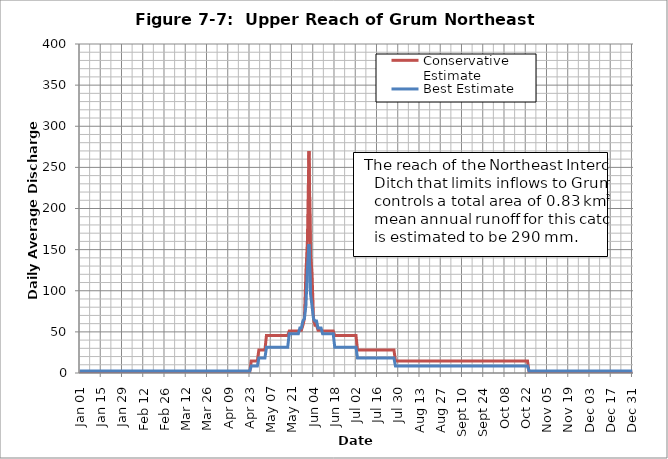
| Category | Conservative Estimate | Best Estimate |
|---|---|---|
| 2005-01-01 | 1.303 | 2.436 |
| 2005-01-02 | 1.303 | 2.436 |
| 2005-01-03 | 1.303 | 2.436 |
| 2005-01-04 | 1.303 | 2.436 |
| 2005-01-05 | 1.303 | 2.436 |
| 2005-01-06 | 1.303 | 2.436 |
| 2005-01-07 | 1.303 | 2.436 |
| 2005-01-08 | 1.303 | 2.436 |
| 2005-01-09 | 1.303 | 2.436 |
| 2005-01-10 | 1.303 | 2.436 |
| 2005-01-11 | 1.303 | 2.436 |
| 2005-01-12 | 1.303 | 2.436 |
| 2005-01-13 | 1.303 | 2.436 |
| 2005-01-14 | 1.303 | 2.436 |
| 2005-01-15 | 1.303 | 2.436 |
| 2005-01-16 | 1.303 | 2.436 |
| 2005-01-17 | 1.303 | 2.436 |
| 2005-01-18 | 1.303 | 2.436 |
| 2005-01-19 | 1.303 | 2.436 |
| 2005-01-20 | 1.303 | 2.436 |
| 2005-01-21 | 1.303 | 2.436 |
| 2005-01-22 | 1.303 | 2.436 |
| 2005-01-23 | 1.303 | 2.436 |
| 2005-01-24 | 1.303 | 2.436 |
| 2005-01-25 | 1.303 | 2.436 |
| 2005-01-26 | 1.303 | 2.436 |
| 2005-01-27 | 1.303 | 2.436 |
| 2005-01-28 | 1.303 | 2.436 |
| 2005-01-29 | 1.303 | 2.436 |
| 2005-01-30 | 1.303 | 2.436 |
| 2005-01-31 | 1.303 | 2.436 |
| 2005-02-01 | 1.303 | 2.436 |
| 2005-02-02 | 1.303 | 2.436 |
| 2005-02-03 | 1.303 | 2.436 |
| 2005-02-04 | 1.303 | 2.436 |
| 2005-02-05 | 1.303 | 2.436 |
| 2005-02-06 | 1.303 | 2.436 |
| 2005-02-07 | 1.303 | 2.436 |
| 2005-02-08 | 1.303 | 2.436 |
| 2005-02-09 | 1.303 | 2.436 |
| 2005-02-10 | 1.303 | 2.436 |
| 2005-02-11 | 1.303 | 2.436 |
| 2005-02-12 | 1.303 | 2.436 |
| 2005-02-13 | 1.303 | 2.436 |
| 2005-02-14 | 1.303 | 2.436 |
| 2005-02-15 | 1.303 | 2.436 |
| 2005-02-16 | 1.303 | 2.436 |
| 2005-02-17 | 1.303 | 2.436 |
| 2005-02-18 | 1.303 | 2.436 |
| 2005-02-19 | 1.303 | 2.436 |
| 2005-02-20 | 1.303 | 2.436 |
| 2005-02-21 | 1.303 | 2.436 |
| 2005-02-22 | 1.303 | 2.436 |
| 2005-02-23 | 1.303 | 2.436 |
| 2005-02-24 | 1.303 | 2.436 |
| 2005-02-25 | 1.303 | 2.436 |
| 2005-02-26 | 1.303 | 2.436 |
| 2005-02-27 | 1.303 | 2.436 |
| 2005-02-28 | 1.303 | 2.436 |
| 2005-03-01 | 1.303 | 2.436 |
| 2005-03-02 | 1.303 | 2.436 |
| 2005-03-03 | 1.303 | 2.436 |
| 2005-03-04 | 1.303 | 2.436 |
| 2005-03-05 | 1.303 | 2.436 |
| 2005-03-06 | 1.303 | 2.436 |
| 2005-03-07 | 1.303 | 2.436 |
| 2005-03-08 | 1.303 | 2.436 |
| 2005-03-09 | 1.303 | 2.436 |
| 2005-03-10 | 1.303 | 2.436 |
| 2005-03-11 | 1.303 | 2.436 |
| 2005-03-12 | 1.303 | 2.436 |
| 2005-03-13 | 1.303 | 2.436 |
| 2005-03-14 | 1.303 | 2.436 |
| 2005-03-15 | 1.303 | 2.436 |
| 2005-03-16 | 1.303 | 2.436 |
| 2005-03-17 | 1.303 | 2.436 |
| 2005-03-18 | 1.303 | 2.436 |
| 2005-03-19 | 1.303 | 2.436 |
| 2005-03-20 | 1.303 | 2.436 |
| 2005-03-21 | 1.303 | 2.436 |
| 2005-03-22 | 1.303 | 2.436 |
| 2005-03-23 | 1.303 | 2.436 |
| 2005-03-24 | 1.303 | 2.436 |
| 2005-03-25 | 1.303 | 2.436 |
| 2005-03-26 | 1.303 | 2.436 |
| 2005-03-27 | 1.303 | 2.436 |
| 2005-03-28 | 1.303 | 2.436 |
| 2005-03-29 | 1.303 | 2.436 |
| 2005-03-30 | 1.303 | 2.436 |
| 2005-03-31 | 1.303 | 2.436 |
| 2005-04-01 | 1.303 | 2.436 |
| 2005-04-02 | 1.303 | 2.436 |
| 2005-04-03 | 1.303 | 2.436 |
| 2005-04-04 | 1.303 | 2.436 |
| 2005-04-05 | 1.303 | 2.436 |
| 2005-04-06 | 1.303 | 2.436 |
| 2005-04-07 | 1.303 | 2.436 |
| 2005-04-08 | 1.303 | 2.436 |
| 2005-04-09 | 1.303 | 2.436 |
| 2005-04-10 | 1.303 | 2.436 |
| 2005-04-11 | 1.303 | 2.436 |
| 2005-04-12 | 1.303 | 2.436 |
| 2005-04-13 | 1.303 | 2.436 |
| 2005-04-14 | 1.303 | 2.436 |
| 2005-04-15 | 1.303 | 2.436 |
| 2005-04-16 | 1.303 | 2.436 |
| 2005-04-17 | 1.303 | 2.436 |
| 2005-04-18 | 1.303 | 2.436 |
| 2005-04-19 | 1.303 | 2.436 |
| 2005-04-20 | 1.303 | 2.436 |
| 2005-04-21 | 1.303 | 2.436 |
| 2005-04-22 | 1.303 | 2.436 |
| 2005-04-23 | 1.303 | 2.436 |
| 2005-04-24 | 14.719 | 8.434 |
| 2005-04-25 | 14.719 | 8.434 |
| 2005-04-26 | 14.719 | 8.434 |
| 2005-04-27 | 14.719 | 8.434 |
| 2005-04-28 | 14.719 | 8.434 |
| 2005-04-29 | 28.056 | 18.106 |
| 2005-04-30 | 28.056 | 18.106 |
| 2005-05-01 | 28.056 | 18.106 |
| 2005-05-02 | 28.056 | 18.106 |
| 2005-05-03 | 28.056 | 18.106 |
| 2005-05-04 | 45.58 | 31.293 |
| 2005-05-05 | 45.58 | 31.293 |
| 2005-05-06 | 45.58 | 31.293 |
| 2005-05-07 | 45.58 | 31.293 |
| 2005-05-08 | 45.58 | 31.293 |
| 2005-05-09 | 45.58 | 31.293 |
| 2005-05-10 | 45.58 | 31.293 |
| 2005-05-11 | 45.58 | 31.293 |
| 2005-05-12 | 45.58 | 31.293 |
| 2005-05-13 | 45.58 | 31.293 |
| 2005-05-14 | 45.58 | 31.293 |
| 2005-05-15 | 45.58 | 31.293 |
| 2005-05-16 | 45.58 | 31.293 |
| 2005-05-17 | 45.58 | 31.293 |
| 2005-05-18 | 45.58 | 31.293 |
| 2005-05-19 | 50.969 | 47.653 |
| 2005-05-20 | 50.969 | 47.653 |
| 2005-05-21 | 50.969 | 47.653 |
| 2005-05-22 | 50.969 | 47.653 |
| 2005-05-23 | 50.969 | 47.653 |
| 2005-05-24 | 50.969 | 47.653 |
| 2005-05-25 | 50.969 | 47.653 |
| 2005-05-26 | 51.938 | 54.648 |
| 2005-05-27 | 51.938 | 54.648 |
| 2005-05-28 | 57.965 | 63.169 |
| 2005-05-29 | 65.978 | 65.954 |
| 2005-05-30 | 121.132 | 82.068 |
| 2005-05-31 | 161.307 | 126.529 |
| 2005-06-01 | 269.75 | 156.605 |
| 2005-06-02 | 145.378 | 96.989 |
| 2005-06-03 | 121.132 | 82.068 |
| 2005-06-04 | 65.978 | 65.954 |
| 2005-06-05 | 57.965 | 63.169 |
| 2005-06-06 | 57.965 | 63.169 |
| 2005-06-07 | 51.938 | 54.648 |
| 2005-06-08 | 51.938 | 54.648 |
| 2005-06-09 | 51.938 | 54.648 |
| 2005-06-10 | 50.969 | 47.653 |
| 2005-06-11 | 50.969 | 47.653 |
| 2005-06-12 | 50.969 | 47.653 |
| 2005-06-13 | 50.969 | 47.653 |
| 2005-06-14 | 50.969 | 47.653 |
| 2005-06-15 | 50.969 | 47.653 |
| 2005-06-16 | 50.969 | 47.653 |
| 2005-06-17 | 50.969 | 47.653 |
| 2005-06-18 | 45.58 | 31.293 |
| 2005-06-19 | 45.58 | 31.293 |
| 2005-06-20 | 45.58 | 31.293 |
| 2005-06-21 | 45.58 | 31.293 |
| 2005-06-22 | 45.58 | 31.293 |
| 2005-06-23 | 45.58 | 31.293 |
| 2005-06-24 | 45.58 | 31.293 |
| 2005-06-25 | 45.58 | 31.293 |
| 2005-06-26 | 45.58 | 31.293 |
| 2005-06-27 | 45.58 | 31.293 |
| 2005-06-28 | 45.58 | 31.293 |
| 2005-06-29 | 45.58 | 31.293 |
| 2005-06-30 | 45.58 | 31.293 |
| 2005-07-01 | 45.58 | 31.293 |
| 2005-07-02 | 45.58 | 31.293 |
| 2005-07-03 | 28.056 | 18.106 |
| 2005-07-04 | 28.056 | 18.106 |
| 2005-07-05 | 28.056 | 18.106 |
| 2005-07-06 | 28.056 | 18.106 |
| 2005-07-07 | 28.056 | 18.106 |
| 2005-07-08 | 28.056 | 18.106 |
| 2005-07-09 | 28.056 | 18.106 |
| 2005-07-10 | 28.056 | 18.106 |
| 2005-07-11 | 28.056 | 18.106 |
| 2005-07-12 | 28.056 | 18.106 |
| 2005-07-13 | 28.056 | 18.106 |
| 2005-07-14 | 28.056 | 18.106 |
| 2005-07-15 | 28.056 | 18.106 |
| 2005-07-16 | 28.056 | 18.106 |
| 2005-07-17 | 28.056 | 18.106 |
| 2005-07-18 | 28.056 | 18.106 |
| 2005-07-19 | 28.056 | 18.106 |
| 2005-07-20 | 28.056 | 18.106 |
| 2005-07-21 | 28.056 | 18.106 |
| 2005-07-22 | 28.056 | 18.106 |
| 2005-07-23 | 28.056 | 18.106 |
| 2005-07-24 | 28.056 | 18.106 |
| 2005-07-25 | 28.056 | 18.106 |
| 2005-07-26 | 28.056 | 18.106 |
| 2005-07-27 | 28.056 | 18.106 |
| 2005-07-28 | 14.719 | 8.434 |
| 2005-07-29 | 14.719 | 8.434 |
| 2005-07-30 | 14.719 | 8.434 |
| 2005-07-31 | 14.719 | 8.434 |
| 2005-08-01 | 14.719 | 8.434 |
| 2005-08-02 | 14.719 | 8.434 |
| 2005-08-03 | 14.719 | 8.434 |
| 2005-08-04 | 14.719 | 8.434 |
| 2005-08-05 | 14.719 | 8.434 |
| 2005-08-06 | 14.719 | 8.434 |
| 2005-08-07 | 14.719 | 8.434 |
| 2005-08-08 | 14.719 | 8.434 |
| 2005-08-09 | 14.719 | 8.434 |
| 2005-08-10 | 14.719 | 8.434 |
| 2005-08-11 | 14.719 | 8.434 |
| 2005-08-12 | 14.719 | 8.434 |
| 2005-08-13 | 14.719 | 8.434 |
| 2005-08-14 | 14.719 | 8.434 |
| 2005-08-15 | 14.719 | 8.434 |
| 2005-08-16 | 14.719 | 8.434 |
| 2005-08-17 | 14.719 | 8.434 |
| 2005-08-18 | 14.719 | 8.434 |
| 2005-08-19 | 14.719 | 8.434 |
| 2005-08-20 | 14.719 | 8.434 |
| 2005-08-21 | 14.719 | 8.434 |
| 2005-08-22 | 14.719 | 8.434 |
| 2005-08-23 | 14.719 | 8.434 |
| 2005-08-24 | 14.719 | 8.434 |
| 2005-08-25 | 14.719 | 8.434 |
| 2005-08-26 | 14.719 | 8.434 |
| 2005-08-27 | 14.719 | 8.434 |
| 2005-08-28 | 14.719 | 8.434 |
| 2005-08-29 | 14.719 | 8.434 |
| 2005-08-30 | 14.719 | 8.434 |
| 2005-08-31 | 14.719 | 8.434 |
| 2005-09-01 | 14.719 | 8.434 |
| 2005-09-02 | 14.719 | 8.434 |
| 2005-09-03 | 14.719 | 8.434 |
| 2005-09-04 | 14.719 | 8.434 |
| 2005-09-05 | 14.719 | 8.434 |
| 2005-09-06 | 14.719 | 8.434 |
| 2005-09-07 | 14.719 | 8.434 |
| 2005-09-08 | 14.719 | 8.434 |
| 2005-09-09 | 14.719 | 8.434 |
| 2005-09-10 | 14.719 | 8.434 |
| 2005-09-11 | 14.719 | 8.434 |
| 2005-09-12 | 14.719 | 8.434 |
| 2005-09-13 | 14.719 | 8.434 |
| 2005-09-14 | 14.719 | 8.434 |
| 2005-09-15 | 14.719 | 8.434 |
| 2005-09-16 | 14.719 | 8.434 |
| 2005-09-17 | 14.719 | 8.434 |
| 2005-09-18 | 14.719 | 8.434 |
| 2005-09-19 | 14.719 | 8.434 |
| 2005-09-20 | 14.719 | 8.434 |
| 2005-09-21 | 14.719 | 8.434 |
| 2005-09-22 | 14.719 | 8.434 |
| 2005-09-23 | 14.719 | 8.434 |
| 2005-09-24 | 14.719 | 8.434 |
| 2005-09-25 | 14.719 | 8.434 |
| 2005-09-26 | 14.719 | 8.434 |
| 2005-09-27 | 14.719 | 8.434 |
| 2005-09-28 | 14.719 | 8.434 |
| 2005-09-29 | 14.719 | 8.434 |
| 2005-09-30 | 14.719 | 8.434 |
| 2005-10-01 | 14.719 | 8.434 |
| 2005-10-02 | 14.719 | 8.434 |
| 2005-10-03 | 14.719 | 8.434 |
| 2005-10-04 | 14.719 | 8.434 |
| 2005-10-05 | 14.719 | 8.434 |
| 2005-10-06 | 14.719 | 8.434 |
| 2005-10-07 | 14.719 | 8.434 |
| 2005-10-08 | 14.719 | 8.434 |
| 2005-10-09 | 14.719 | 8.434 |
| 2005-10-10 | 14.719 | 8.434 |
| 2005-10-11 | 14.719 | 8.434 |
| 2005-10-12 | 14.719 | 8.434 |
| 2005-10-13 | 14.719 | 8.434 |
| 2005-10-14 | 14.719 | 8.434 |
| 2005-10-15 | 14.719 | 8.434 |
| 2005-10-16 | 14.719 | 8.434 |
| 2005-10-17 | 14.719 | 8.434 |
| 2005-10-18 | 14.719 | 8.434 |
| 2005-10-19 | 14.719 | 8.434 |
| 2005-10-20 | 14.719 | 8.434 |
| 2005-10-21 | 14.719 | 8.434 |
| 2005-10-22 | 14.719 | 8.434 |
| 2005-10-23 | 14.719 | 8.434 |
| 2005-10-24 | 1.303 | 2.436 |
| 2005-10-25 | 1.303 | 2.436 |
| 2005-10-26 | 1.303 | 2.436 |
| 2005-10-27 | 1.303 | 2.436 |
| 2005-10-28 | 1.303 | 2.436 |
| 2005-10-29 | 1.303 | 2.436 |
| 2005-10-30 | 1.303 | 2.436 |
| 2005-10-31 | 1.303 | 2.436 |
| 2005-11-01 | 1.303 | 2.436 |
| 2005-11-02 | 1.303 | 2.436 |
| 2005-11-03 | 1.303 | 2.436 |
| 2005-11-04 | 1.303 | 2.436 |
| 2005-11-05 | 1.303 | 2.436 |
| 2005-11-06 | 1.303 | 2.436 |
| 2005-11-07 | 1.303 | 2.436 |
| 2005-11-08 | 1.303 | 2.436 |
| 2005-11-09 | 1.303 | 2.436 |
| 2005-11-10 | 1.303 | 2.436 |
| 2005-11-11 | 1.303 | 2.436 |
| 2005-11-12 | 1.303 | 2.436 |
| 2005-11-13 | 1.303 | 2.436 |
| 2005-11-14 | 1.303 | 2.436 |
| 2005-11-15 | 1.303 | 2.436 |
| 2005-11-16 | 1.303 | 2.436 |
| 2005-11-17 | 1.303 | 2.436 |
| 2005-11-18 | 1.303 | 2.436 |
| 2005-11-19 | 1.303 | 2.436 |
| 2005-11-20 | 1.303 | 2.436 |
| 2005-11-21 | 1.303 | 2.436 |
| 2005-11-22 | 1.303 | 2.436 |
| 2005-11-23 | 1.303 | 2.436 |
| 2005-11-24 | 1.303 | 2.436 |
| 2005-11-25 | 1.303 | 2.436 |
| 2005-11-26 | 1.303 | 2.436 |
| 2005-11-27 | 1.303 | 2.436 |
| 2005-11-28 | 1.303 | 2.436 |
| 2005-11-29 | 1.303 | 2.436 |
| 2005-11-30 | 1.303 | 2.436 |
| 2005-12-01 | 1.303 | 2.436 |
| 2005-12-02 | 1.303 | 2.436 |
| 2005-12-03 | 1.303 | 2.436 |
| 2005-12-04 | 1.303 | 2.436 |
| 2005-12-05 | 1.303 | 2.436 |
| 2005-12-06 | 1.303 | 2.436 |
| 2005-12-07 | 1.303 | 2.436 |
| 2005-12-08 | 1.303 | 2.436 |
| 2005-12-09 | 1.303 | 2.436 |
| 2005-12-10 | 1.303 | 2.436 |
| 2005-12-11 | 1.303 | 2.436 |
| 2005-12-12 | 1.303 | 2.436 |
| 2005-12-13 | 1.303 | 2.436 |
| 2005-12-14 | 1.303 | 2.436 |
| 2005-12-15 | 1.303 | 2.436 |
| 2005-12-16 | 1.303 | 2.436 |
| 2005-12-17 | 1.303 | 2.436 |
| 2005-12-18 | 1.303 | 2.436 |
| 2005-12-19 | 1.303 | 2.436 |
| 2005-12-20 | 1.303 | 2.436 |
| 2005-12-21 | 1.303 | 2.436 |
| 2005-12-22 | 1.303 | 2.436 |
| 2005-12-23 | 1.303 | 2.436 |
| 2005-12-24 | 1.303 | 2.436 |
| 2005-12-25 | 1.303 | 2.436 |
| 2005-12-26 | 1.303 | 2.436 |
| 2005-12-27 | 1.303 | 2.436 |
| 2005-12-28 | 1.303 | 2.436 |
| 2005-12-29 | 1.303 | 2.436 |
| 2005-12-30 | 1.303 | 2.436 |
| 2005-12-31 | 1.303 | 2.436 |